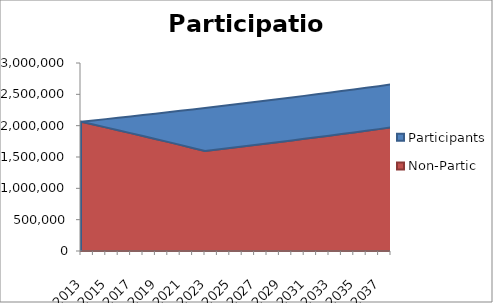
| Category | Non-Partic | Participants |
|---|---|---|
| 2013.0 | 2062040 | 0 |
| 2014.0 | 2017513.808 | 65559 |
| 2015.0 | 1972546.561 | 131773.59 |
| 2016.0 | 1927133.89 | 198650.326 |
| 2017.0 | 1881271.386 | 266195.829 |
| 2018.0 | 1834954.593 | 334416.787 |
| 2019.0 | 1788179.014 | 403319.955 |
| 2020.0 | 1740940.103 | 472912.155 |
| 2021.0 | 1693233.275 | 543200.276 |
| 2022.0 | 1645053.894 | 614191.279 |
| 2023.0 | 1596397.282 | 685892.192 |
| 2024.0 | 1619676.635 | 685892.192 |
| 2025.0 | 1643193.437 | 685892.192 |
| 2026.0 | 1666950.11 | 685892.192 |
| 2027.0 | 1690949.102 | 685892.192 |
| 2028.0 | 1715192.883 | 685892.192 |
| 2029.0 | 1739683.951 | 685892.192 |
| 2030.0 | 1764424.828 | 685892.192 |
| 2031.0 | 1789418.061 | 685892.192 |
| 2032.0 | 1814666.226 | 685892.192 |
| 2033.0 | 1840171.922 | 685892.192 |
| 2034.0 | 1865937.776 | 685892.192 |
| 2035.0 | 1891966.441 | 685892.192 |
| 2036.0 | 1918260.599 | 685892.192 |
| 2037.0 | 1944822.958 | 685892.192 |
| 2038.0 | 1971656.252 | 685892.192 |